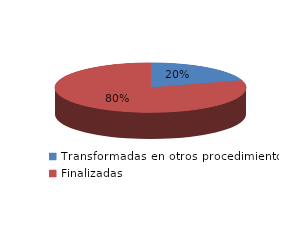
| Category | Series 0 |
|---|---|
| Transformadas en otros procedimientos | 2681 |
| Finalizadas | 10654 |